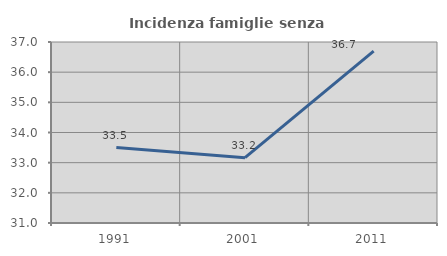
| Category | Incidenza famiglie senza nuclei |
|---|---|
| 1991.0 | 33.5 |
| 2001.0 | 33.166 |
| 2011.0 | 36.697 |